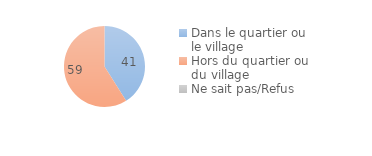
| Category | Series 0 |
|---|---|
| Dans le quartier ou le village | 41.053 |
| Hors du quartier ou du village | 58.947 |
| Ne sait pas/Refus | 0 |